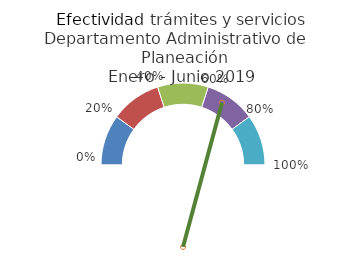
| Category | 2.668943473 |
|---|---|
| 0.0 | 0.2 |
| 0.2 | 0.2 |
| 0.4 | 0.2 |
| 0.6 | 0.2 |
| 0.8 | 0.2 |
| 1.0 | 1 |